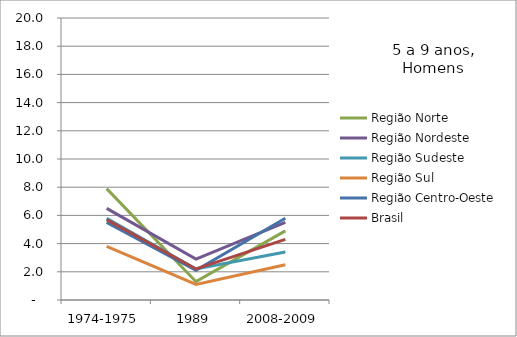
| Category | Região Norte | Região Nordeste | Região Sudeste | Região Sul | Região Centro-Oeste | Brasil |
|---|---|---|---|---|---|---|
| 1974-1975 | 7.9 | 6.5 | 5.8 | 3.8 | 5.5 | 5.7 |
| 1989 | 1.3 | 2.9 | 2.2 | 1.1 | 2.1 | 2.2 |
| 2008-2009 | 4.9 | 5.5 | 3.4 | 2.5 | 5.8 | 4.3 |